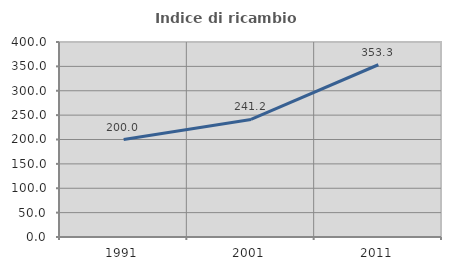
| Category | Indice di ricambio occupazionale  |
|---|---|
| 1991.0 | 200 |
| 2001.0 | 241.176 |
| 2011.0 | 353.333 |